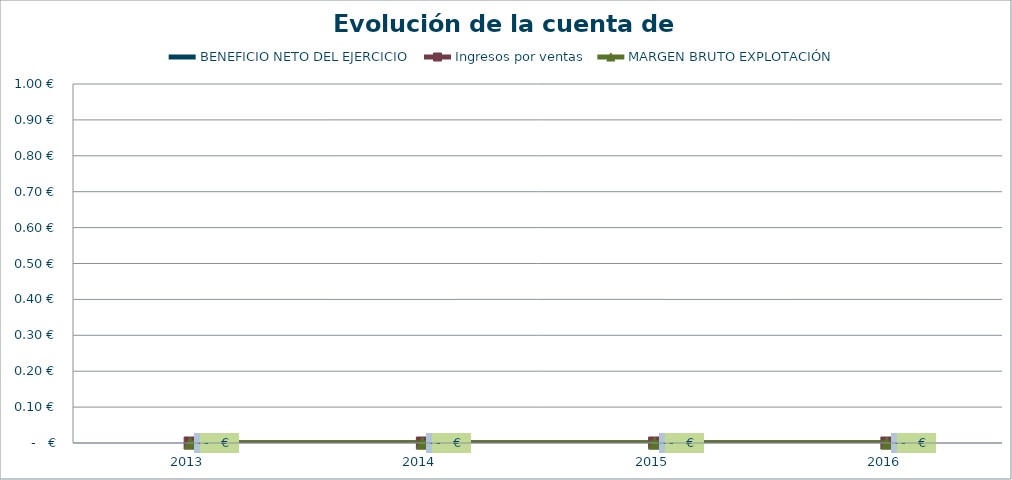
| Category | BENEFICIO NETO DEL EJERCICIO | Ingresos por ventas | MARGEN BRUTO EXPLOTACIÓN |
|---|---|---|---|
| 2013.0 | 0 | 0 | 0 |
| 2014.0 | 0 | 0 | 0 |
| 2015.0 | 0 | 0 | 0 |
| 2016.0 | 0 | 0 | 0 |